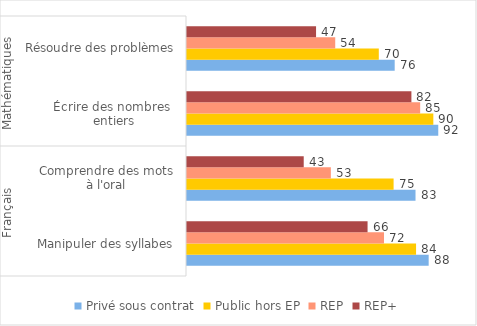
| Category | Privé sous contrat | Public hors EP | REP | REP+ |
|---|---|---|---|---|
| 0 | 88.2 | 83.6 | 71.9 | 65.9 |
| 1 | 83.4 | 75.4 | 52.5 | 42.6 |
| 2 | 91.7 | 89.9 | 85.1 | 81.9 |
| 3 | 75.8 | 70 | 54.1 | 47.1 |